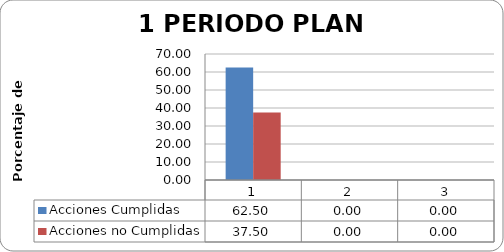
| Category | Acciones Cumplidas | Acciones no Cumplidas |
|---|---|---|
| 0 | 62.5 | 37.5 |
| 1 | 0 | 0 |
| 2 | 0 | 0 |